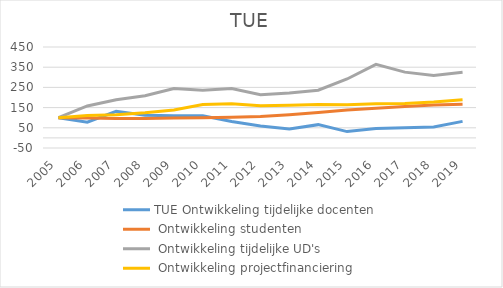
| Category | TUE |
|---|---|
| 2005.0 | 100 |
| 2006.0 | 110.616 |
| 2007.0 | 114.041 |
| 2008.0 | 123.973 |
| 2009.0 | 138.527 |
| 2010.0 | 165.068 |
| 2011.0 | 168.836 |
| 2012.0 | 159.589 |
| 2013.0 | 161.13 |
| 2014.0 | 164.897 |
| 2015.0 | 163.87 |
| 2016.0 | 168.493 |
| 2017.0 | 169.863 |
| 2018.0 | 177.911 |
| 2019.0 | 189.212 |